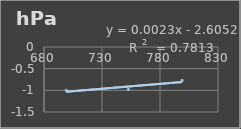
| Category | Presión Atmosférica |
|---|---|
| 699.1 | -1 |
| 752.7 | -0.98 |
| 799.1 | -0.77 |